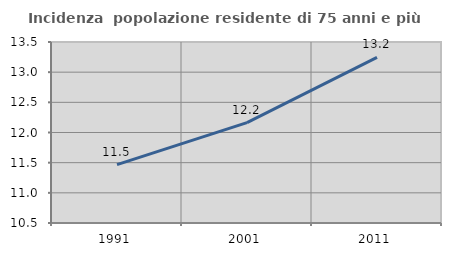
| Category | Incidenza  popolazione residente di 75 anni e più |
|---|---|
| 1991.0 | 11.468 |
| 2001.0 | 12.164 |
| 2011.0 | 13.246 |